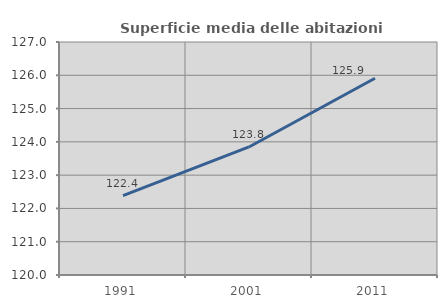
| Category | Superficie media delle abitazioni occupate |
|---|---|
| 1991.0 | 122.383 |
| 2001.0 | 123.847 |
| 2011.0 | 125.911 |